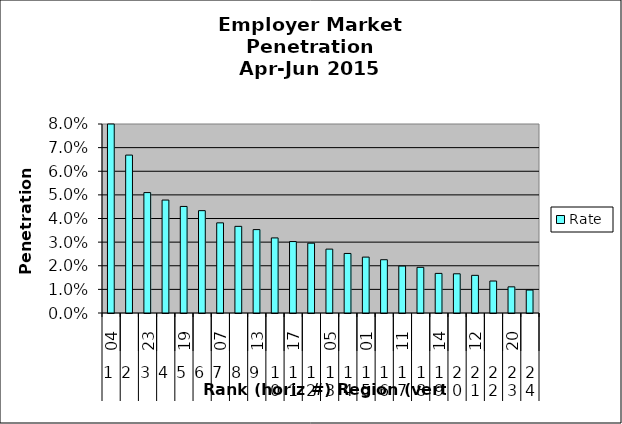
| Category | Rate |
|---|---|
| 0 | 0.112 |
| 1 | 0.067 |
| 2 | 0.051 |
| 3 | 0.048 |
| 4 | 0.045 |
| 5 | 0.043 |
| 6 | 0.038 |
| 7 | 0.037 |
| 8 | 0.035 |
| 9 | 0.032 |
| 10 | 0.03 |
| 11 | 0.03 |
| 12 | 0.027 |
| 13 | 0.025 |
| 14 | 0.024 |
| 15 | 0.023 |
| 16 | 0.02 |
| 17 | 0.019 |
| 18 | 0.017 |
| 19 | 0.017 |
| 20 | 0.016 |
| 21 | 0.014 |
| 22 | 0.011 |
| 23 | 0.01 |